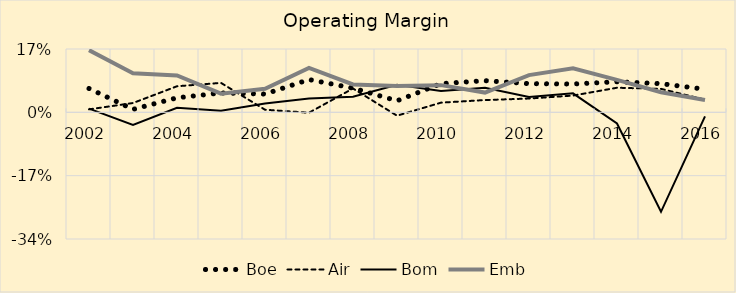
| Category | Boe | Air | Bom | Emb |
|---|---|---|---|---|
| 2002.0 | 0.064 | 0.008 | 0.01 | 0.167 |
| 2003.0 | 0.008 | 0.025 | -0.034 | 0.105 |
| 2004.0 | 0.039 | 0.07 | 0.012 | 0.099 |
| 2005.0 | 0.052 | 0.079 | 0.004 | 0.05 |
| 2006.0 | 0.049 | 0.007 | 0.024 | 0.063 |
| 2007.0 | 0.088 | -0.001 | 0.037 | 0.119 |
| 2008.0 | 0.065 | 0.064 | 0.042 | 0.075 |
| 2009.0 | 0.031 | -0.009 | 0.074 | 0.071 |
| 2010.0 | 0.077 | 0.026 | 0.057 | 0.073 |
| 2011.0 | 0.085 | 0.033 | 0.066 | 0.053 |
| 2012.0 | 0.077 | 0.037 | 0.041 | 0.1 |
| 2013.0 | 0.076 | 0.045 | 0.051 | 0.118 |
| 2014.0 | 0.082 | 0.066 | -0.03 | 0.087 |
| 2015.0 | 0.077 | 0.063 | -0.267 | 0.054 |
| 2016.0 | 0.062 | 0.034 | -0.011 | 0.033 |